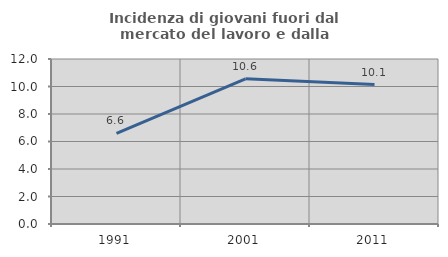
| Category | Incidenza di giovani fuori dal mercato del lavoro e dalla formazione  |
|---|---|
| 1991.0 | 6.599 |
| 2001.0 | 10.559 |
| 2011.0 | 10.145 |